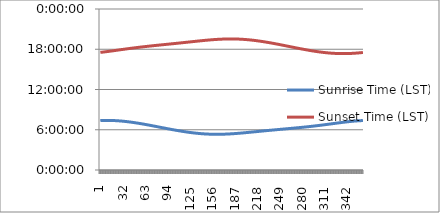
| Category | Sunrise Time (LST) | Sunset Time (LST) |
|---|---|---|
| 0 | 0.307 | 0.731 |
| 1 | 0.308 | 0.731 |
| 2 | 0.308 | 0.732 |
| 3 | 0.308 | 0.732 |
| 4 | 0.308 | 0.733 |
| 5 | 0.308 | 0.733 |
| 6 | 0.308 | 0.734 |
| 7 | 0.308 | 0.734 |
| 8 | 0.308 | 0.735 |
| 9 | 0.308 | 0.735 |
| 10 | 0.308 | 0.736 |
| 11 | 0.308 | 0.737 |
| 12 | 0.308 | 0.737 |
| 13 | 0.308 | 0.738 |
| 14 | 0.308 | 0.738 |
| 15 | 0.308 | 0.739 |
| 16 | 0.308 | 0.74 |
| 17 | 0.307 | 0.74 |
| 18 | 0.307 | 0.741 |
| 19 | 0.307 | 0.741 |
| 20 | 0.307 | 0.742 |
| 21 | 0.307 | 0.743 |
| 22 | 0.306 | 0.743 |
| 23 | 0.306 | 0.744 |
| 24 | 0.306 | 0.745 |
| 25 | 0.305 | 0.745 |
| 26 | 0.305 | 0.746 |
| 27 | 0.305 | 0.746 |
| 28 | 0.304 | 0.747 |
| 29 | 0.304 | 0.748 |
| 30 | 0.304 | 0.748 |
| 31 | 0.303 | 0.749 |
| 32 | 0.303 | 0.75 |
| 33 | 0.302 | 0.75 |
| 34 | 0.302 | 0.751 |
| 35 | 0.301 | 0.751 |
| 36 | 0.301 | 0.752 |
| 37 | 0.3 | 0.753 |
| 38 | 0.3 | 0.753 |
| 39 | 0.299 | 0.754 |
| 40 | 0.299 | 0.754 |
| 41 | 0.298 | 0.755 |
| 42 | 0.297 | 0.756 |
| 43 | 0.297 | 0.756 |
| 44 | 0.296 | 0.757 |
| 45 | 0.296 | 0.757 |
| 46 | 0.295 | 0.758 |
| 47 | 0.294 | 0.759 |
| 48 | 0.294 | 0.759 |
| 49 | 0.293 | 0.76 |
| 50 | 0.292 | 0.76 |
| 51 | 0.292 | 0.761 |
| 52 | 0.291 | 0.761 |
| 53 | 0.29 | 0.762 |
| 54 | 0.289 | 0.762 |
| 55 | 0.289 | 0.763 |
| 56 | 0.288 | 0.763 |
| 57 | 0.287 | 0.764 |
| 58 | 0.286 | 0.764 |
| 59 | 0.286 | 0.765 |
| 60 | 0.285 | 0.766 |
| 61 | 0.284 | 0.766 |
| 62 | 0.283 | 0.767 |
| 63 | 0.282 | 0.767 |
| 64 | 0.282 | 0.768 |
| 65 | 0.281 | 0.768 |
| 66 | 0.28 | 0.769 |
| 67 | 0.279 | 0.769 |
| 68 | 0.278 | 0.77 |
| 69 | 0.277 | 0.77 |
| 70 | 0.277 | 0.77 |
| 71 | 0.276 | 0.771 |
| 72 | 0.275 | 0.771 |
| 73 | 0.274 | 0.772 |
| 74 | 0.273 | 0.772 |
| 75 | 0.272 | 0.773 |
| 76 | 0.271 | 0.773 |
| 77 | 0.271 | 0.774 |
| 78 | 0.27 | 0.774 |
| 79 | 0.269 | 0.775 |
| 80 | 0.268 | 0.775 |
| 81 | 0.267 | 0.776 |
| 82 | 0.266 | 0.776 |
| 83 | 0.265 | 0.777 |
| 84 | 0.264 | 0.777 |
| 85 | 0.264 | 0.777 |
| 86 | 0.263 | 0.778 |
| 87 | 0.262 | 0.778 |
| 88 | 0.261 | 0.779 |
| 89 | 0.26 | 0.779 |
| 90 | 0.259 | 0.78 |
| 91 | 0.258 | 0.78 |
| 92 | 0.257 | 0.781 |
| 93 | 0.257 | 0.781 |
| 94 | 0.256 | 0.781 |
| 95 | 0.255 | 0.782 |
| 96 | 0.254 | 0.782 |
| 97 | 0.253 | 0.783 |
| 98 | 0.252 | 0.783 |
| 99 | 0.252 | 0.784 |
| 100 | 0.251 | 0.784 |
| 101 | 0.25 | 0.785 |
| 102 | 0.249 | 0.785 |
| 103 | 0.248 | 0.786 |
| 104 | 0.248 | 0.786 |
| 105 | 0.247 | 0.786 |
| 106 | 0.246 | 0.787 |
| 107 | 0.245 | 0.787 |
| 108 | 0.244 | 0.788 |
| 109 | 0.244 | 0.788 |
| 110 | 0.243 | 0.789 |
| 111 | 0.242 | 0.789 |
| 112 | 0.241 | 0.79 |
| 113 | 0.241 | 0.79 |
| 114 | 0.24 | 0.791 |
| 115 | 0.239 | 0.791 |
| 116 | 0.239 | 0.792 |
| 117 | 0.238 | 0.792 |
| 118 | 0.237 | 0.793 |
| 119 | 0.237 | 0.793 |
| 120 | 0.236 | 0.794 |
| 121 | 0.235 | 0.794 |
| 122 | 0.235 | 0.794 |
| 123 | 0.234 | 0.795 |
| 124 | 0.233 | 0.795 |
| 125 | 0.233 | 0.796 |
| 126 | 0.232 | 0.796 |
| 127 | 0.232 | 0.797 |
| 128 | 0.231 | 0.797 |
| 129 | 0.231 | 0.798 |
| 130 | 0.23 | 0.798 |
| 131 | 0.23 | 0.799 |
| 132 | 0.229 | 0.799 |
| 133 | 0.229 | 0.8 |
| 134 | 0.228 | 0.8 |
| 135 | 0.228 | 0.801 |
| 136 | 0.227 | 0.801 |
| 137 | 0.227 | 0.802 |
| 138 | 0.226 | 0.802 |
| 139 | 0.226 | 0.802 |
| 140 | 0.226 | 0.803 |
| 141 | 0.225 | 0.803 |
| 142 | 0.225 | 0.804 |
| 143 | 0.225 | 0.804 |
| 144 | 0.224 | 0.805 |
| 145 | 0.224 | 0.805 |
| 146 | 0.224 | 0.806 |
| 147 | 0.224 | 0.806 |
| 148 | 0.223 | 0.806 |
| 149 | 0.223 | 0.807 |
| 150 | 0.223 | 0.807 |
| 151 | 0.223 | 0.808 |
| 152 | 0.223 | 0.808 |
| 153 | 0.222 | 0.808 |
| 154 | 0.222 | 0.809 |
| 155 | 0.222 | 0.809 |
| 156 | 0.222 | 0.809 |
| 157 | 0.222 | 0.81 |
| 158 | 0.222 | 0.81 |
| 159 | 0.222 | 0.81 |
| 160 | 0.222 | 0.811 |
| 161 | 0.222 | 0.811 |
| 162 | 0.222 | 0.811 |
| 163 | 0.222 | 0.812 |
| 164 | 0.222 | 0.812 |
| 165 | 0.222 | 0.812 |
| 166 | 0.222 | 0.812 |
| 167 | 0.222 | 0.813 |
| 168 | 0.222 | 0.813 |
| 169 | 0.222 | 0.813 |
| 170 | 0.222 | 0.813 |
| 171 | 0.222 | 0.813 |
| 172 | 0.223 | 0.813 |
| 173 | 0.223 | 0.814 |
| 174 | 0.223 | 0.814 |
| 175 | 0.223 | 0.814 |
| 176 | 0.223 | 0.814 |
| 177 | 0.224 | 0.814 |
| 178 | 0.224 | 0.814 |
| 179 | 0.224 | 0.814 |
| 180 | 0.224 | 0.814 |
| 181 | 0.225 | 0.814 |
| 182 | 0.225 | 0.814 |
| 183 | 0.225 | 0.814 |
| 184 | 0.225 | 0.814 |
| 185 | 0.226 | 0.814 |
| 186 | 0.226 | 0.814 |
| 187 | 0.226 | 0.814 |
| 188 | 0.227 | 0.814 |
| 189 | 0.227 | 0.813 |
| 190 | 0.227 | 0.813 |
| 191 | 0.228 | 0.813 |
| 192 | 0.228 | 0.813 |
| 193 | 0.229 | 0.813 |
| 194 | 0.229 | 0.813 |
| 195 | 0.229 | 0.812 |
| 196 | 0.23 | 0.812 |
| 197 | 0.23 | 0.812 |
| 198 | 0.23 | 0.811 |
| 199 | 0.231 | 0.811 |
| 200 | 0.231 | 0.811 |
| 201 | 0.232 | 0.811 |
| 202 | 0.232 | 0.81 |
| 203 | 0.233 | 0.81 |
| 204 | 0.233 | 0.809 |
| 205 | 0.233 | 0.809 |
| 206 | 0.234 | 0.809 |
| 207 | 0.234 | 0.808 |
| 208 | 0.235 | 0.808 |
| 209 | 0.235 | 0.807 |
| 210 | 0.236 | 0.807 |
| 211 | 0.236 | 0.806 |
| 212 | 0.236 | 0.806 |
| 213 | 0.237 | 0.805 |
| 214 | 0.237 | 0.805 |
| 215 | 0.238 | 0.804 |
| 216 | 0.238 | 0.804 |
| 217 | 0.239 | 0.803 |
| 218 | 0.239 | 0.802 |
| 219 | 0.24 | 0.802 |
| 220 | 0.24 | 0.801 |
| 221 | 0.24 | 0.8 |
| 222 | 0.241 | 0.8 |
| 223 | 0.241 | 0.799 |
| 224 | 0.242 | 0.798 |
| 225 | 0.242 | 0.798 |
| 226 | 0.243 | 0.797 |
| 227 | 0.243 | 0.796 |
| 228 | 0.244 | 0.796 |
| 229 | 0.244 | 0.795 |
| 230 | 0.244 | 0.794 |
| 231 | 0.245 | 0.793 |
| 232 | 0.245 | 0.793 |
| 233 | 0.246 | 0.792 |
| 234 | 0.246 | 0.791 |
| 235 | 0.247 | 0.79 |
| 236 | 0.247 | 0.79 |
| 237 | 0.247 | 0.789 |
| 238 | 0.248 | 0.788 |
| 239 | 0.248 | 0.787 |
| 240 | 0.249 | 0.786 |
| 241 | 0.249 | 0.785 |
| 242 | 0.249 | 0.785 |
| 243 | 0.25 | 0.784 |
| 244 | 0.25 | 0.783 |
| 245 | 0.251 | 0.782 |
| 246 | 0.251 | 0.781 |
| 247 | 0.251 | 0.78 |
| 248 | 0.252 | 0.779 |
| 249 | 0.252 | 0.779 |
| 250 | 0.253 | 0.778 |
| 251 | 0.253 | 0.777 |
| 252 | 0.253 | 0.776 |
| 253 | 0.254 | 0.775 |
| 254 | 0.254 | 0.774 |
| 255 | 0.255 | 0.773 |
| 256 | 0.255 | 0.772 |
| 257 | 0.256 | 0.771 |
| 258 | 0.256 | 0.771 |
| 259 | 0.256 | 0.77 |
| 260 | 0.257 | 0.769 |
| 261 | 0.257 | 0.768 |
| 262 | 0.258 | 0.767 |
| 263 | 0.258 | 0.766 |
| 264 | 0.258 | 0.765 |
| 265 | 0.259 | 0.764 |
| 266 | 0.259 | 0.763 |
| 267 | 0.26 | 0.762 |
| 268 | 0.26 | 0.762 |
| 269 | 0.26 | 0.761 |
| 270 | 0.261 | 0.76 |
| 271 | 0.261 | 0.759 |
| 272 | 0.262 | 0.758 |
| 273 | 0.262 | 0.757 |
| 274 | 0.263 | 0.756 |
| 275 | 0.263 | 0.755 |
| 276 | 0.263 | 0.754 |
| 277 | 0.264 | 0.754 |
| 278 | 0.264 | 0.753 |
| 279 | 0.265 | 0.752 |
| 280 | 0.265 | 0.751 |
| 281 | 0.266 | 0.75 |
| 282 | 0.266 | 0.749 |
| 283 | 0.267 | 0.749 |
| 284 | 0.267 | 0.748 |
| 285 | 0.267 | 0.747 |
| 286 | 0.268 | 0.746 |
| 287 | 0.268 | 0.745 |
| 288 | 0.269 | 0.745 |
| 289 | 0.269 | 0.744 |
| 290 | 0.27 | 0.743 |
| 291 | 0.27 | 0.742 |
| 292 | 0.271 | 0.741 |
| 293 | 0.271 | 0.741 |
| 294 | 0.272 | 0.74 |
| 295 | 0.272 | 0.739 |
| 296 | 0.273 | 0.739 |
| 297 | 0.273 | 0.738 |
| 298 | 0.274 | 0.737 |
| 299 | 0.274 | 0.736 |
| 300 | 0.275 | 0.736 |
| 301 | 0.276 | 0.735 |
| 302 | 0.276 | 0.735 |
| 303 | 0.277 | 0.734 |
| 304 | 0.277 | 0.733 |
| 305 | 0.278 | 0.733 |
| 306 | 0.278 | 0.732 |
| 307 | 0.279 | 0.732 |
| 308 | 0.279 | 0.731 |
| 309 | 0.28 | 0.73 |
| 310 | 0.281 | 0.73 |
| 311 | 0.281 | 0.729 |
| 312 | 0.282 | 0.729 |
| 313 | 0.282 | 0.729 |
| 314 | 0.283 | 0.728 |
| 315 | 0.284 | 0.728 |
| 316 | 0.284 | 0.727 |
| 317 | 0.285 | 0.727 |
| 318 | 0.285 | 0.726 |
| 319 | 0.286 | 0.726 |
| 320 | 0.287 | 0.726 |
| 321 | 0.287 | 0.725 |
| 322 | 0.288 | 0.725 |
| 323 | 0.288 | 0.725 |
| 324 | 0.289 | 0.725 |
| 325 | 0.29 | 0.724 |
| 326 | 0.29 | 0.724 |
| 327 | 0.291 | 0.724 |
| 328 | 0.291 | 0.724 |
| 329 | 0.292 | 0.724 |
| 330 | 0.293 | 0.723 |
| 331 | 0.293 | 0.723 |
| 332 | 0.294 | 0.723 |
| 333 | 0.294 | 0.723 |
| 334 | 0.295 | 0.723 |
| 335 | 0.295 | 0.723 |
| 336 | 0.296 | 0.723 |
| 337 | 0.297 | 0.723 |
| 338 | 0.297 | 0.723 |
| 339 | 0.298 | 0.723 |
| 340 | 0.298 | 0.723 |
| 341 | 0.299 | 0.723 |
| 342 | 0.299 | 0.723 |
| 343 | 0.3 | 0.723 |
| 344 | 0.3 | 0.723 |
| 345 | 0.301 | 0.724 |
| 346 | 0.301 | 0.724 |
| 347 | 0.302 | 0.724 |
| 348 | 0.302 | 0.724 |
| 349 | 0.302 | 0.724 |
| 350 | 0.303 | 0.725 |
| 351 | 0.303 | 0.725 |
| 352 | 0.304 | 0.725 |
| 353 | 0.304 | 0.726 |
| 354 | 0.304 | 0.726 |
| 355 | 0.305 | 0.726 |
| 356 | 0.305 | 0.727 |
| 357 | 0.305 | 0.727 |
| 358 | 0.306 | 0.727 |
| 359 | 0.306 | 0.728 |
| 360 | 0.306 | 0.728 |
| 361 | 0.307 | 0.729 |
| 362 | 0.307 | 0.729 |
| 363 | 0.307 | 0.729 |
| 364 | 0.307 | 0.73 |
| 365 | 0.307 | 0.73 |